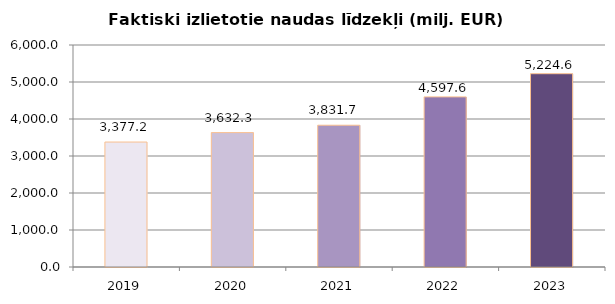
| Category | Faktiski izlietotie naudas līdzekļi (milj. EUR) ar PVN |
|---|---|
| 2019.0 | 3377.208 |
| 2020.0 | 3632.314 |
| 2021.0 | 3831.667 |
| 2022.0 | 4597.646 |
| 2023.0 | 5224.61 |